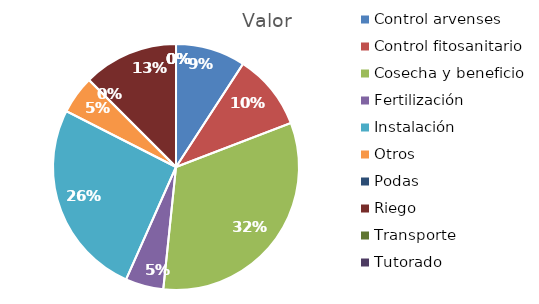
| Category | Valor |
|---|---|
| Control arvenses | 584419 |
| Control fitosanitario | 637548 |
| Cosecha y beneficio | 2070000 |
| Fertilización | 318774 |
| Instalación | 1646999 |
| Otros | 318774 |
| Podas | 0 |
| Riego | 796935 |
| Transporte | 0 |
| Tutorado | 0 |